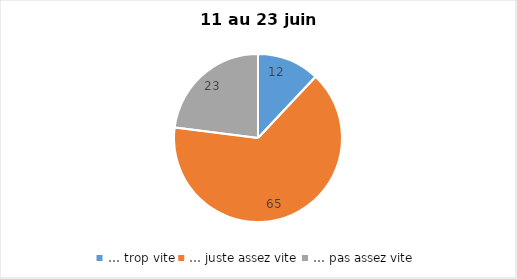
| Category | Series 0 |
|---|---|
| … trop vite | 12 |
| … juste assez vite | 65 |
| … pas assez vite | 23 |